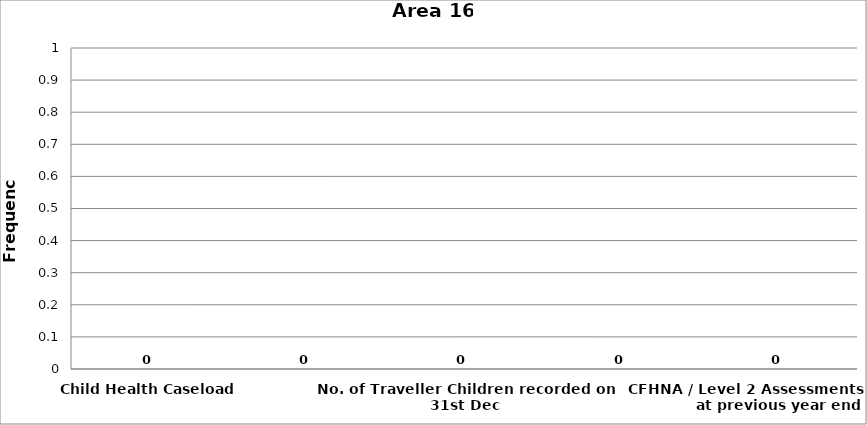
| Category | Area 16 |
|---|---|
| Child Health Caseload | 0 |
| No. of Roma Children recorded on 31st Dec | 0 |
| No. of Traveller Children recorded on 31st Dec | 0 |
| Homeless Children recorded on 31st Dec | 0 |
| CFHNA / Level 2 Assessments in place at previous year end | 0 |